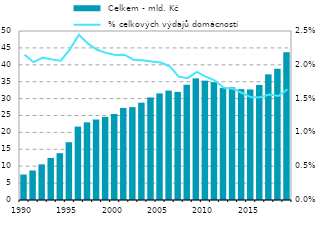
| Category |  Celkem - mld. Kč |
|---|---|
| 1990.0 | 7.53 |
| 1991.0 | 8.734 |
| 1992.0 | 10.552 |
| 1993.0 | 12.445 |
| 1994.0 | 13.848 |
| 1995.0 | 17.093 |
| 1996.0 | 21.716 |
| 1997.0 | 22.977 |
| 1998.0 | 23.81 |
| 1999.0 | 24.588 |
| 2000.0 | 25.451 |
| 2001.0 | 27.243 |
| 2002.0 | 27.473 |
| 2003.0 | 28.797 |
| 2004.0 | 30.341 |
| 2005.0 | 31.532 |
| 2006.0 | 32.371 |
| 2007.0 | 31.994 |
| 2008.0 | 34.093 |
| 2009.0 | 35.989 |
| 2010.0 | 35.305 |
| 2011.0 | 34.868 |
| 2012.0 | 33.151 |
| 2013.0 | 33.324 |
| 2014.0 | 32.792 |
| 2015.0 | 32.698 |
| 2016.0 | 34.045 |
| 2017.0 | 37.17 |
| 2018.0 | 38.837 |
| 2019.0 | 43.734 |